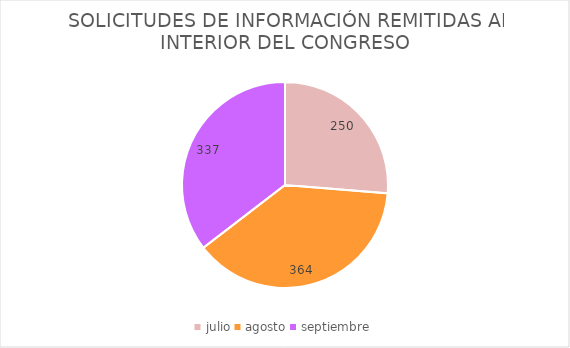
| Category | SOLICITUDES DE INFORMACIÓN REMITIDAS AL INTERIOR DEL CONGRESO  |
|---|---|
| julio | 250 |
| agosto | 364 |
| septiembre | 337 |